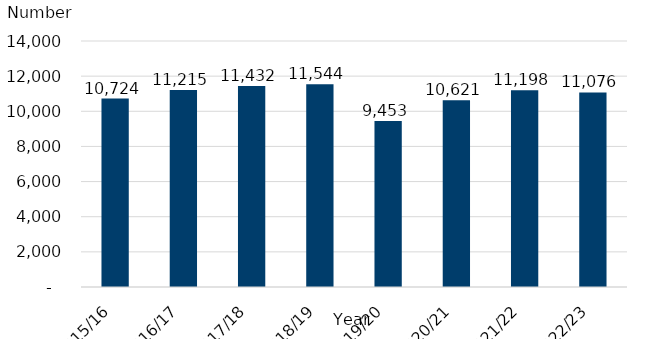
| Category | Number of children attending the Cylchoedd Meithrin |
|---|---|
| 2015/16 | 10724 |
| 2016/17 | 11215 |
| 2017/18 | 11432 |
| 2018/19 | 11544 |
| 2019/20 | 9453 |
| 2020/21 | 10621 |
| 2021/22 | 11198 |
| 2022/23 | 11076 |